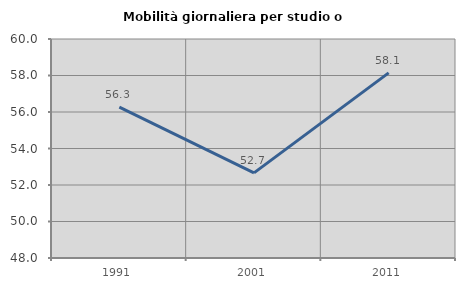
| Category | Mobilità giornaliera per studio o lavoro |
|---|---|
| 1991.0 | 56.265 |
| 2001.0 | 52.666 |
| 2011.0 | 58.142 |